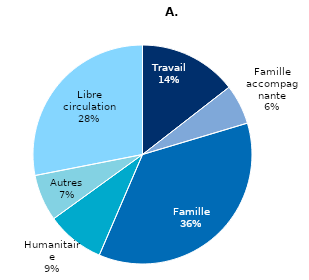
| Category | Series 0 |
|---|---|
| Travail | 659464 |
| Famille accompagnante | 268210 |
| Famille | 1642830.265 |
| Humanitaire | 390696 |
| Autres | 313699 |
| Libre circulation | 1278441.48 |